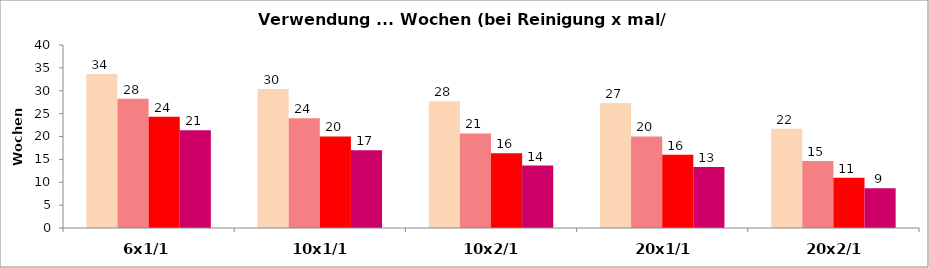
| Category | Series 0 | Series 3 | Series 6 | Series 9 |
|---|---|---|---|---|
| 6x1/1 | 33.67 | 28.249 | 24.331 | 21.34 |
| 10x1/1 | 30.358 | 24.015 | 20.008 | 17.007 |
| 10x2/1 | 27.685 | 20.678 | 16.34 | 13.661 |
| 20x1/1 | 27.322 | 20.008 | 15.995 | 13.333 |
| 20x2/1 | 21.673 | 14.671 | 11.001 | 8.667 |